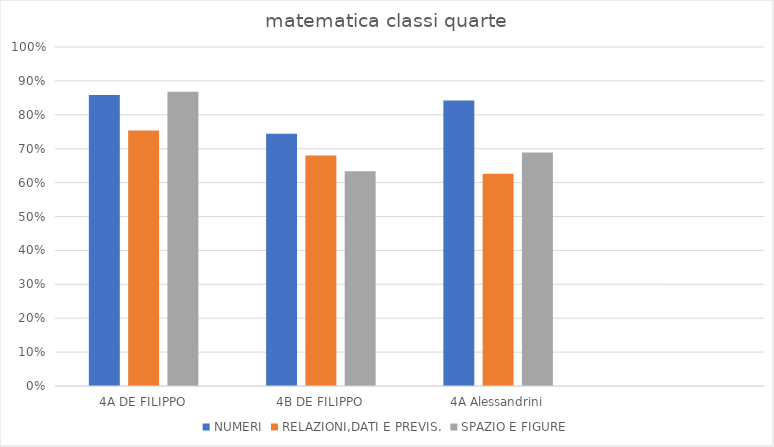
| Category | NUMERI | RELAZIONI,DATI E PREVIS. | SPAZIO E FIGURE |
|---|---|---|---|
| 4A DE FILIPPO | 0.858 | 0.753 | 0.868 |
| 4B DE FILIPPO | 0.744 | 0.68 | 0.634 |
| 4A Alessandrini | 0.842 | 0.626 | 0.689 |
|   | 0 | 0 | 0 |